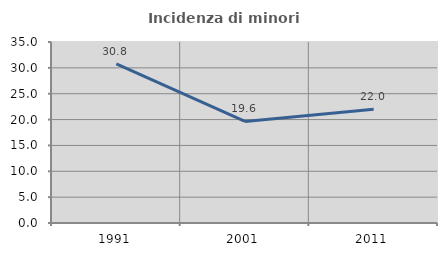
| Category | Incidenza di minori stranieri |
|---|---|
| 1991.0 | 30.769 |
| 2001.0 | 19.643 |
| 2011.0 | 22.007 |